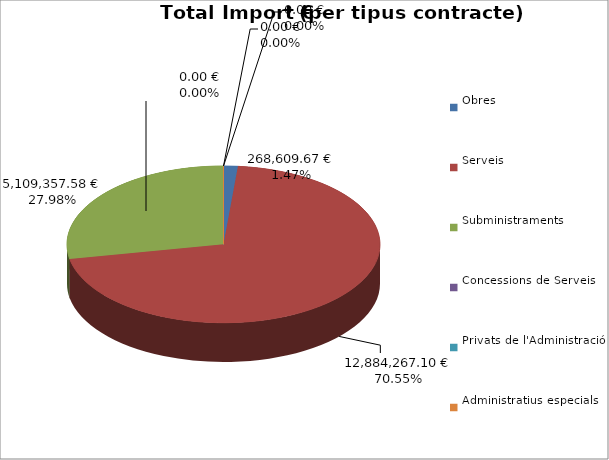
| Category | Total preu
(amb IVA) |
|---|---|
| Obres | 268609.67 |
| Serveis | 12884267.1 |
| Subministraments | 5109357.58 |
| Concessions de Serveis | 0 |
| Privats de l'Administració | 0 |
| Administratius especials | 0 |